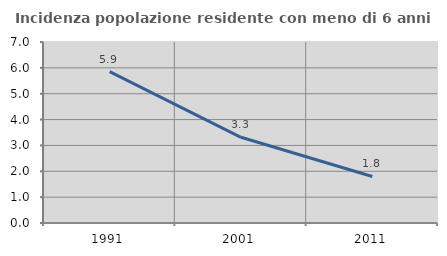
| Category | Incidenza popolazione residente con meno di 6 anni |
|---|---|
| 1991.0 | 5.856 |
| 2001.0 | 3.315 |
| 2011.0 | 1.8 |